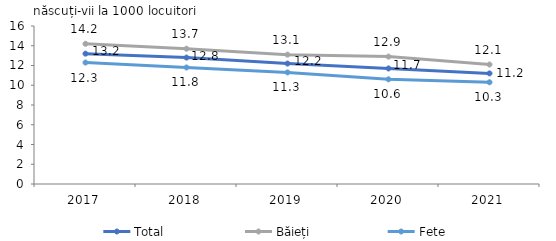
| Category | Total  | Băieți | Fete |
|---|---|---|---|
| 2017.0 | 13.2 | 14.2 | 12.3 |
| 2018.0 | 12.8 | 13.7 | 11.8 |
| 2019.0 | 12.2 | 13.1 | 11.3 |
| 2020.0 | 11.7 | 12.9 | 10.6 |
| 2021.0 | 11.2 | 12.1 | 10.3 |